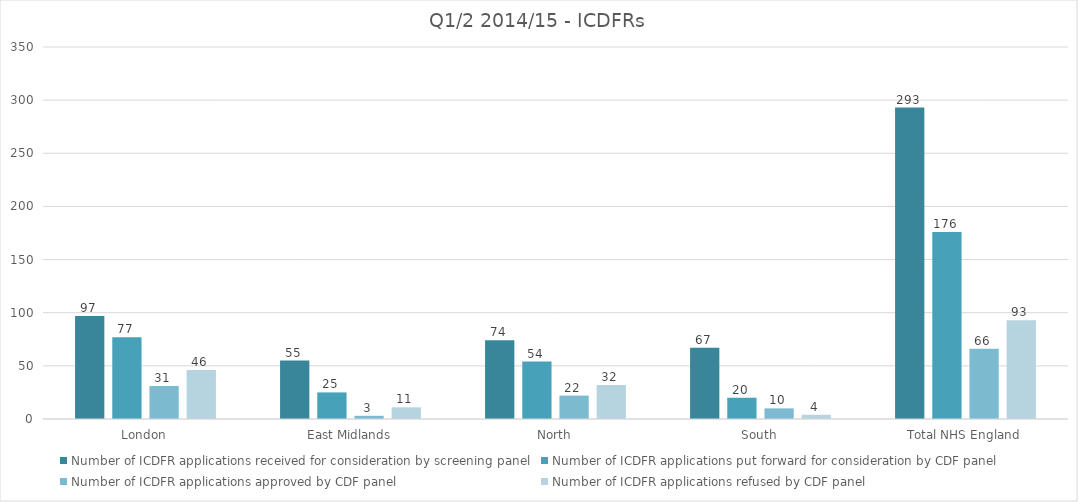
| Category | Number of ICDFR applications received for consideration by screening panel | Number of ICDFR applications put forward for consideration by CDF panel | Number of ICDFR applications approved by CDF panel | Number of ICDFR applications refused by CDF panel |
|---|---|---|---|---|
| London | 97 | 77 | 31 | 46 |
| East Midlands | 55 | 25 | 3 | 11 |
| North | 74 | 54 | 22 | 32 |
| South | 67 | 20 | 10 | 4 |
| Total NHS England | 293 | 176 | 66 | 93 |